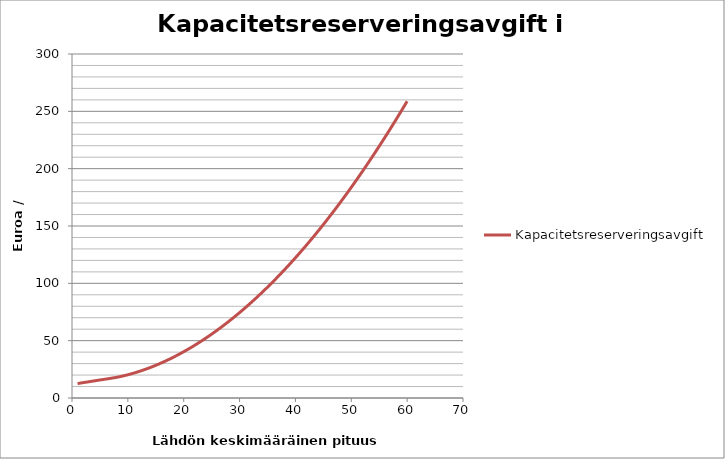
| Category | Kapacitetsreserveringsavgift |
|---|---|
| 1.0 | 12.603 |
| 2.0 | 13.417 |
| 3.0 | 14.159 |
| 4.0 | 14.959 |
| 5.0 | 15.712 |
| 6.0 | 16.442 |
| 7.0 | 17.204 |
| 8.0 | 18.051 |
| 9.0 | 19.075 |
| 10.0 | 20.266 |
| 11.0 | 21.615 |
| 12.0 | 23.117 |
| 13.0 | 24.769 |
| 14.0 | 26.568 |
| 15.0 | 28.512 |
| 16.0 | 30.598 |
| 17.0 | 32.827 |
| 18.0 | 35.197 |
| 19.0 | 37.708 |
| 20.0 | 40.358 |
| 21.0 | 43.147 |
| 22.0 | 46.075 |
| 23.0 | 49.141 |
| 24.0 | 52.346 |
| 25.0 | 55.688 |
| 26.0 | 59.168 |
| 27.0 | 62.785 |
| 28.0 | 66.54 |
| 29.0 | 70.432 |
| 30.0 | 74.461 |
| 31.0 | 78.627 |
| 32.0 | 82.93 |
| 33.0 | 87.37 |
| 34.0 | 91.946 |
| 35.0 | 96.66 |
| 36.0 | 101.509 |
| 37.0 | 106.496 |
| 38.0 | 111.618 |
| 39.0 | 116.878 |
| 40.0 | 122.273 |
| 41.0 | 127.805 |
| 42.0 | 133.474 |
| 43.0 | 139.279 |
| 44.0 | 145.22 |
| 45.0 | 151.297 |
| 46.0 | 157.511 |
| 47.0 | 163.861 |
| 48.0 | 170.347 |
| 49.0 | 176.969 |
| 50.0 | 183.728 |
| 51.0 | 190.623 |
| 52.0 | 197.654 |
| 53.0 | 204.821 |
| 54.0 | 212.124 |
| 55.0 | 219.564 |
| 56.0 | 227.139 |
| 57.0 | 234.851 |
| 58.0 | 242.699 |
| 59.0 | 250.683 |
| 60.0 | 258.803 |